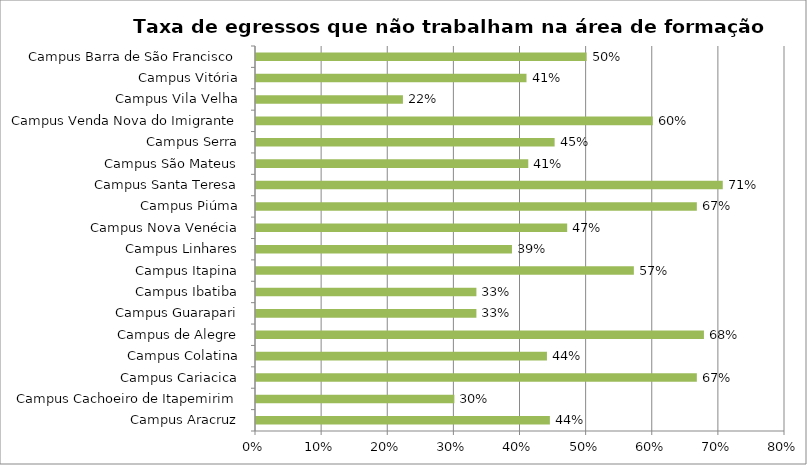
| Category | % não trabalham na área de formação |
|---|---|
| Campus Aracruz | 0.444 |
| Campus Cachoeiro de Itapemirim | 0.3 |
| Campus Cariacica | 0.667 |
| Campus Colatina | 0.44 |
| Campus de Alegre | 0.677 |
| Campus Guarapari | 0.333 |
| Campus Ibatiba | 0.333 |
| Campus Itapina | 0.571 |
| Campus Linhares | 0.387 |
| Campus Nova Venécia | 0.471 |
| Campus Piúma | 0.667 |
| Campus Santa Teresa | 0.706 |
| Campus São Mateus | 0.412 |
| Campus Serra | 0.452 |
| Campus Venda Nova do Imigrante | 0.6 |
| Campus Vila Velha | 0.222 |
| Campus Vitória | 0.409 |
| Campus Barra de São Francisco | 0.5 |